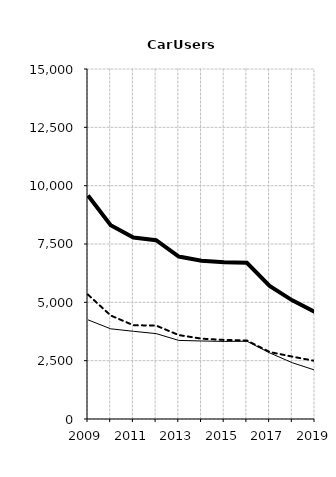
| Category | Built-up | Non built-up | Total |
|---|---|---|---|
| 2009.0 | 4249 | 5330 | 9579 |
| 2010.0 | 3865 | 4436 | 8301 |
| 2011.0 | 3759 | 4018 | 7777 |
| 2012.0 | 3660 | 4005 | 7665 |
| 2013.0 | 3368 | 3596 | 6964 |
| 2014.0 | 3343 | 3443 | 6786 |
| 2015.0 | 3325 | 3388 | 6713 |
| 2016.0 | 3332 | 3365 | 6697 |
| 2017.0 | 2835 | 2872 | 5707 |
| 2018.0 | 2412 | 2673 | 5085 |
| 2019.0 | 2093 | 2488 | 4581 |